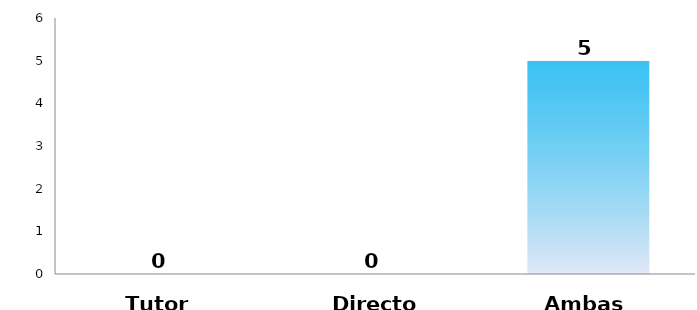
| Category | Series 0 |
|---|---|
| Tutor | 0 |
| Director | 0 |
| Ambas | 5 |